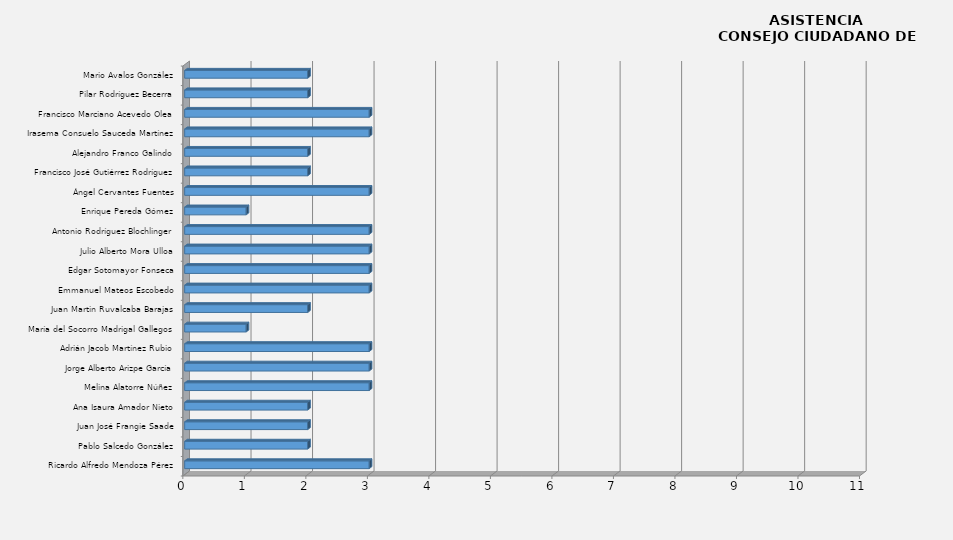
| Category | Series 0 |
|---|---|
| Ricardo Alfredo Mendoza Pérez | 3 |
| Pablo Salcedo González | 2 |
| Juan José Frangie Saade | 2 |
| Ana Isaura Amador Nieto | 2 |
| Melina Alatorre Núñez | 3 |
| Jorge Alberto Arizpe García | 3 |
| Adrián Jacob Martínez Rubio | 3 |
| María del Socorro Madrigal Gallegos | 1 |
| Juan Martin Ruvalcaba Barajas | 2 |
| Emmanuel Mateos Escobedo | 3 |
| Edgar Sotomayor Fonseca | 3 |
| Julio Alberto Mora Ulloa | 3 |
| Antonio Rodríguez Blochlinger | 3 |
| Enrique Pereda Gómez | 1 |
| Ángel Cervantes Fuentes | 3 |
| Francisco José Gutiérrez Rodríguez | 2 |
| Alejandro Franco Galindo | 2 |
| Irasema Consuelo Sauceda Martínez | 3 |
| Francisco Marciano Acevedo Olea | 3 |
| Pilar Rodríguez Becerra | 2 |
| Mario Avalos González | 2 |